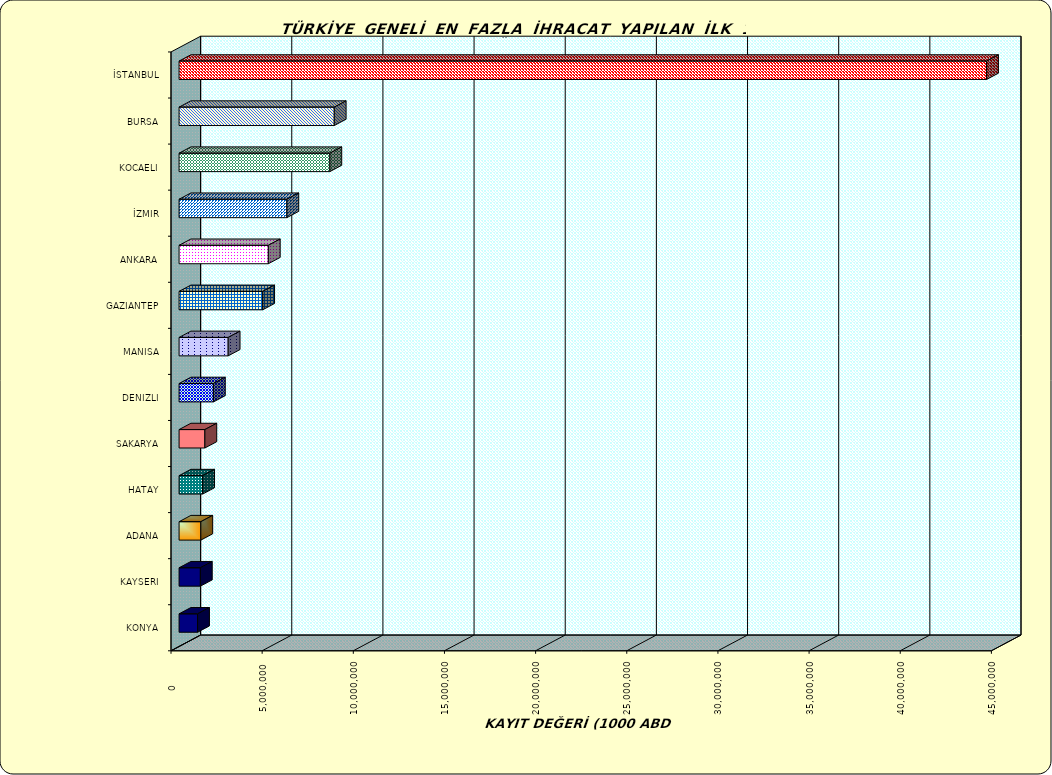
| Category | Series 0 |
|---|---|
| İSTANBUL | 44293457.134 |
| BURSA | 8512999.745 |
| KOCAELI | 8270667.882 |
| İZMIR | 5912309.02 |
| ANKARA | 4896140.207 |
| GAZIANTEP | 4586659.584 |
| MANISA | 2693063.461 |
| DENIZLI | 1884089.501 |
| SAKARYA | 1415706.766 |
| HATAY | 1292659.092 |
| ADANA | 1193380.938 |
| KAYSERI | 1168167.326 |
| KONYA | 1014883.152 |